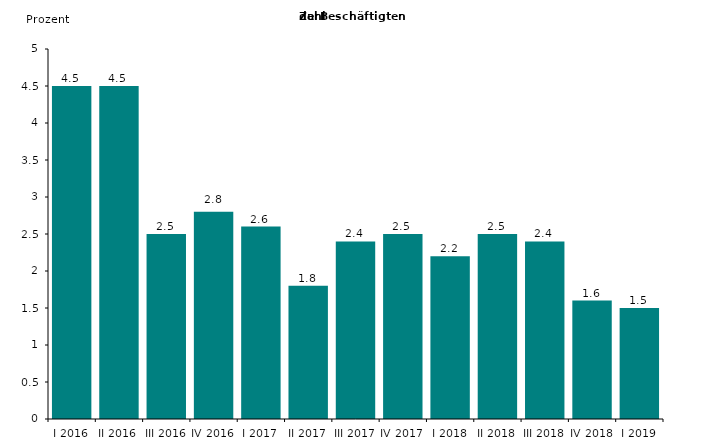
| Category | Series 0 |
|---|---|
| I 2016 | 4.5 |
| II 2016 | 4.5 |
| III 2016 | 2.5 |
| IV 2016 | 2.8 |
| I 2017 | 2.6 |
| II 2017 | 1.8 |
| III 2017 | 2.4 |
| IV 2017 | 2.5 |
| I 2018 | 2.2 |
| II 2018 | 2.5 |
| III 2018 | 2.4 |
| IV 2018 | 1.6 |
| I 2019 | 1.5 |